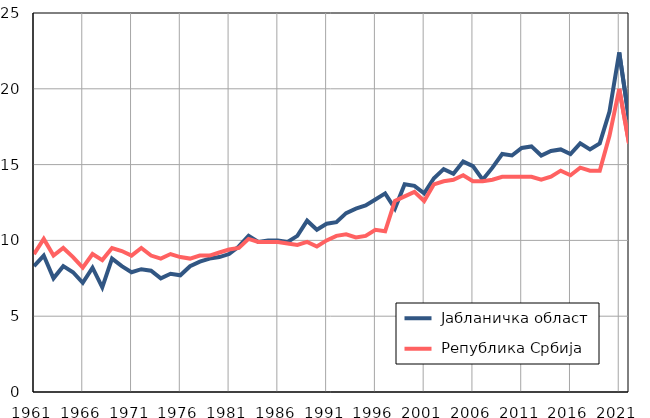
| Category |  Јабланичка област |  Република Србија |
|---|---|---|
| 1961.0 | 8.3 | 9.1 |
| 1962.0 | 9 | 10.1 |
| 1963.0 | 7.5 | 9 |
| 1964.0 | 8.3 | 9.5 |
| 1965.0 | 7.9 | 8.9 |
| 1966.0 | 7.2 | 8.2 |
| 1967.0 | 8.2 | 9.1 |
| 1968.0 | 6.9 | 8.7 |
| 1969.0 | 8.8 | 9.5 |
| 1970.0 | 8.3 | 9.3 |
| 1971.0 | 7.9 | 9 |
| 1972.0 | 8.1 | 9.5 |
| 1973.0 | 8 | 9 |
| 1974.0 | 7.5 | 8.8 |
| 1975.0 | 7.8 | 9.1 |
| 1976.0 | 7.7 | 8.9 |
| 1977.0 | 8.3 | 8.8 |
| 1978.0 | 8.6 | 9 |
| 1979.0 | 8.8 | 9 |
| 1980.0 | 8.9 | 9.2 |
| 1981.0 | 9.1 | 9.4 |
| 1982.0 | 9.6 | 9.5 |
| 1983.0 | 10.3 | 10.1 |
| 1984.0 | 9.9 | 9.9 |
| 1985.0 | 10 | 9.9 |
| 1986.0 | 10 | 9.9 |
| 1987.0 | 9.9 | 9.8 |
| 1988.0 | 10.3 | 9.7 |
| 1989.0 | 11.3 | 9.9 |
| 1990.0 | 10.7 | 9.6 |
| 1991.0 | 11.1 | 10 |
| 1992.0 | 11.2 | 10.3 |
| 1993.0 | 11.8 | 10.4 |
| 1994.0 | 12.1 | 10.2 |
| 1995.0 | 12.3 | 10.3 |
| 1996.0 | 12.7 | 10.7 |
| 1997.0 | 13.1 | 10.6 |
| 1998.0 | 12.1 | 12.6 |
| 1999.0 | 13.7 | 12.9 |
| 2000.0 | 13.6 | 13.2 |
| 2001.0 | 13.1 | 12.6 |
| 2002.0 | 14.1 | 13.7 |
| 2003.0 | 14.7 | 13.9 |
| 2004.0 | 14.4 | 14 |
| 2005.0 | 15.2 | 14.3 |
| 2006.0 | 14.9 | 13.9 |
| 2007.0 | 14 | 13.9 |
| 2008.0 | 14.8 | 14 |
| 2009.0 | 15.7 | 14.2 |
| 2010.0 | 15.6 | 14.2 |
| 2011.0 | 16.1 | 14.2 |
| 2012.0 | 16.2 | 14.2 |
| 2013.0 | 15.6 | 14 |
| 2014.0 | 15.9 | 14.2 |
| 2015.0 | 16 | 14.6 |
| 2016.0 | 15.7 | 14.3 |
| 2017.0 | 16.4 | 14.8 |
| 2018.0 | 16 | 14.6 |
| 2019.0 | 16.4 | 14.6 |
| 2020.0 | 18.5 | 16.9 |
| 2021.0 | 22.4 | 20 |
| 2022.0 | 18 | 16.4 |